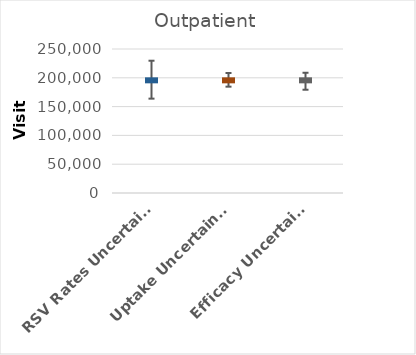
| Category | Series 0 |
|---|---|
| RSV Rates Uncertainty* | 196470 |
| Uptake Uncertainty^ | 196470 |
| Efficacy Uncertainty° | 196470 |